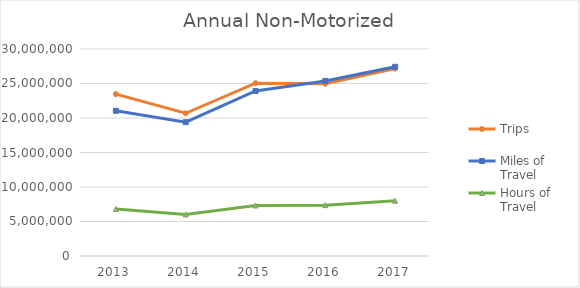
| Category | Trips | Miles of Travel | Hours of Travel |
|---|---|---|---|
| 2013 | 23465590.108 | 21045322.638 | 6800793.461 |
| 2014 | 20683016.15 | 19399190.529 | 6032441.463 |
| 2015 | 25048272.922 | 23915227.776 | 7324531.979 |
| 2016 | 24970011.876 | 25373458.831 | 7370392.037 |
| 2017 | 27151097.66 | 27417438.827 | 8006453.747 |